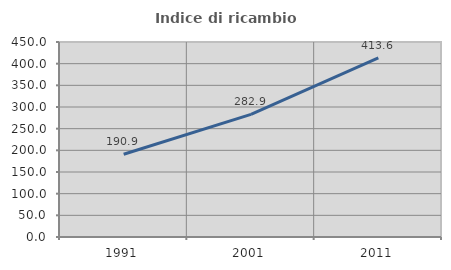
| Category | Indice di ricambio occupazionale  |
|---|---|
| 1991.0 | 190.909 |
| 2001.0 | 282.927 |
| 2011.0 | 413.636 |